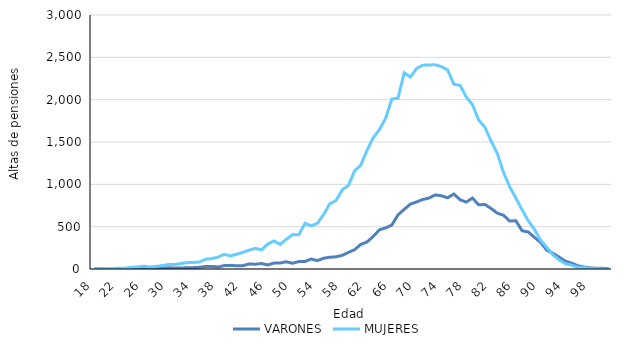
| Category | VARONES | MUJERES |
|---|---|---|
| 18.0 | 0 | 3 |
| 19.0 | 2 | 1 |
| 20.0 | 1 | 5 |
| 21.0 | 2 | 6 |
| 22.0 | 2 | 9 |
| 23.0 | 5 | 10 |
| 24.0 | 5 | 19 |
| 25.0 | 8 | 25 |
| 26.0 | 6 | 34 |
| 27.0 | 6 | 24 |
| 28.0 | 10 | 30 |
| 29.0 | 8 | 41 |
| 30.0 | 15 | 53 |
| 31.0 | 11 | 52 |
| 32.0 | 11 | 65 |
| 33.0 | 16 | 75 |
| 34.0 | 16 | 78 |
| 35.0 | 20 | 83 |
| 36.0 | 30 | 116 |
| 37.0 | 31 | 122 |
| 38.0 | 24 | 142 |
| 39.0 | 41 | 174 |
| 40.0 | 43 | 154 |
| 41.0 | 38 | 175 |
| 42.0 | 39 | 197 |
| 43.0 | 60 | 223 |
| 44.0 | 56 | 244 |
| 45.0 | 65 | 226 |
| 46.0 | 48 | 295 |
| 47.0 | 70 | 332 |
| 48.0 | 71 | 290 |
| 49.0 | 85 | 351 |
| 50.0 | 68 | 406 |
| 51.0 | 88 | 404 |
| 52.0 | 88 | 540 |
| 53.0 | 118 | 509 |
| 54.0 | 99 | 540 |
| 55.0 | 127 | 643 |
| 56.0 | 139 | 770 |
| 57.0 | 144 | 808 |
| 58.0 | 161 | 935 |
| 59.0 | 196 | 986 |
| 60.0 | 228 | 1159 |
| 61.0 | 290 | 1227 |
| 62.0 | 319 | 1402 |
| 63.0 | 384 | 1550 |
| 64.0 | 463 | 1647 |
| 65.0 | 485 | 1780 |
| 66.0 | 519 | 2007 |
| 67.0 | 640 | 2019 |
| 68.0 | 704 | 2317 |
| 69.0 | 767 | 2268 |
| 70.0 | 792 | 2369 |
| 71.0 | 821 | 2407 |
| 72.0 | 838 | 2410 |
| 73.0 | 875 | 2412 |
| 74.0 | 865 | 2390 |
| 75.0 | 841 | 2351 |
| 76.0 | 886 | 2182 |
| 77.0 | 818 | 2168 |
| 78.0 | 790 | 2032 |
| 79.0 | 838 | 1941 |
| 80.0 | 758 | 1759 |
| 81.0 | 762 | 1675 |
| 82.0 | 715 | 1512 |
| 83.0 | 660 | 1366 |
| 84.0 | 636 | 1143 |
| 85.0 | 566 | 972 |
| 86.0 | 570 | 837 |
| 87.0 | 452 | 699 |
| 88.0 | 437 | 569 |
| 89.0 | 374 | 467 |
| 90.0 | 313 | 338 |
| 91.0 | 221 | 255 |
| 92.0 | 185 | 166 |
| 93.0 | 139 | 106 |
| 94.0 | 92 | 61 |
| 95.0 | 69 | 46 |
| 96.0 | 38 | 21 |
| 97.0 | 24 | 19 |
| 98.0 | 13 | 5 |
| 99.0 | 9 | 4 |
| 100.0 | 8 | 1 |
| 101.0 | 4 | 0 |